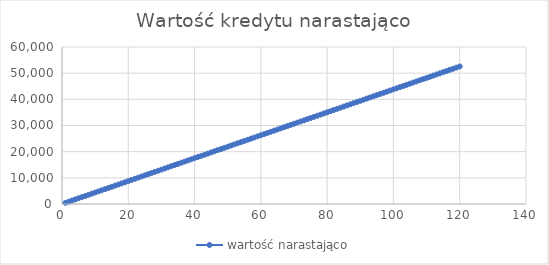
| Category | wartość narastająco |
|---|---|
| 0 | 438.021 |
| 1 | 876.041 |
| 2 | 1314.062 |
| 3 | 1752.082 |
| 4 | 2190.103 |
| 5 | 2628.124 |
| 6 | 3066.144 |
| 7 | 3504.165 |
| 8 | 3942.185 |
| 9 | 4380.206 |
| 10 | 4818.227 |
| 11 | 5256.247 |
| 12 | 5694.268 |
| 13 | 6132.288 |
| 14 | 6570.309 |
| 15 | 7008.33 |
| 16 | 7446.35 |
| 17 | 7884.371 |
| 18 | 8322.392 |
| 19 | 8760.412 |
| 20 | 9198.433 |
| 21 | 9636.453 |
| 22 | 10074.474 |
| 23 | 10512.495 |
| 24 | 10950.515 |
| 25 | 11388.536 |
| 26 | 11826.556 |
| 27 | 12264.577 |
| 28 | 12702.598 |
| 29 | 13140.618 |
| 30 | 13578.639 |
| 31 | 14016.659 |
| 32 | 14454.68 |
| 33 | 14892.701 |
| 34 | 15330.721 |
| 35 | 15768.742 |
| 36 | 16206.762 |
| 37 | 16644.783 |
| 38 | 17082.804 |
| 39 | 17520.824 |
| 40 | 17958.845 |
| 41 | 18396.865 |
| 42 | 18834.886 |
| 43 | 19272.907 |
| 44 | 19710.927 |
| 45 | 20148.948 |
| 46 | 20586.969 |
| 47 | 21024.989 |
| 48 | 21463.01 |
| 49 | 21901.03 |
| 50 | 22339.051 |
| 51 | 22777.072 |
| 52 | 23215.092 |
| 53 | 23653.113 |
| 54 | 24091.133 |
| 55 | 24529.154 |
| 56 | 24967.175 |
| 57 | 25405.195 |
| 58 | 25843.216 |
| 59 | 26281.236 |
| 60 | 26719.257 |
| 61 | 27157.278 |
| 62 | 27595.298 |
| 63 | 28033.319 |
| 64 | 28471.339 |
| 65 | 28909.36 |
| 66 | 29347.381 |
| 67 | 29785.401 |
| 68 | 30223.422 |
| 69 | 30661.442 |
| 70 | 31099.463 |
| 71 | 31537.484 |
| 72 | 31975.504 |
| 73 | 32413.525 |
| 74 | 32851.546 |
| 75 | 33289.566 |
| 76 | 33727.587 |
| 77 | 34165.607 |
| 78 | 34603.628 |
| 79 | 35041.649 |
| 80 | 35479.669 |
| 81 | 35917.69 |
| 82 | 36355.71 |
| 83 | 36793.731 |
| 84 | 37231.752 |
| 85 | 37669.772 |
| 86 | 38107.793 |
| 87 | 38545.813 |
| 88 | 38983.834 |
| 89 | 39421.855 |
| 90 | 39859.875 |
| 91 | 40297.896 |
| 92 | 40735.916 |
| 93 | 41173.937 |
| 94 | 41611.958 |
| 95 | 42049.978 |
| 96 | 42487.999 |
| 97 | 42926.019 |
| 98 | 43364.04 |
| 99 | 43802.061 |
| 100 | 44240.081 |
| 101 | 44678.102 |
| 102 | 45116.123 |
| 103 | 45554.143 |
| 104 | 45992.164 |
| 105 | 46430.184 |
| 106 | 46868.205 |
| 107 | 47306.226 |
| 108 | 47744.246 |
| 109 | 48182.267 |
| 110 | 48620.287 |
| 111 | 49058.308 |
| 112 | 49496.329 |
| 113 | 49934.349 |
| 114 | 50372.37 |
| 115 | 50810.39 |
| 116 | 51248.411 |
| 117 | 51686.432 |
| 118 | 52124.452 |
| 119 | 52562.473 |
| 120 | 0 |
| 121 | 0 |
| 122 | 0 |
| 123 | 0 |
| 124 | 0 |
| 125 | 0 |
| 126 | 0 |
| 127 | 0 |
| 128 | 0 |
| 129 | 0 |
| 130 | 0 |
| 131 | 0 |
| 132 | 0 |
| 133 | 0 |
| 134 | 0 |
| 135 | 0 |
| 136 | 0 |
| 137 | 0 |
| 138 | 0 |
| 139 | 0 |
| 140 | 0 |
| 141 | 0 |
| 142 | 0 |
| 143 | 0 |
| 144 | 0 |
| 145 | 0 |
| 146 | 0 |
| 147 | 0 |
| 148 | 0 |
| 149 | 0 |
| 150 | 0 |
| 151 | 0 |
| 152 | 0 |
| 153 | 0 |
| 154 | 0 |
| 155 | 0 |
| 156 | 0 |
| 157 | 0 |
| 158 | 0 |
| 159 | 0 |
| 160 | 0 |
| 161 | 0 |
| 162 | 0 |
| 163 | 0 |
| 164 | 0 |
| 165 | 0 |
| 166 | 0 |
| 167 | 0 |
| 168 | 0 |
| 169 | 0 |
| 170 | 0 |
| 171 | 0 |
| 172 | 0 |
| 173 | 0 |
| 174 | 0 |
| 175 | 0 |
| 176 | 0 |
| 177 | 0 |
| 178 | 0 |
| 179 | 0 |
| 180 | 0 |
| 181 | 0 |
| 182 | 0 |
| 183 | 0 |
| 184 | 0 |
| 185 | 0 |
| 186 | 0 |
| 187 | 0 |
| 188 | 0 |
| 189 | 0 |
| 190 | 0 |
| 191 | 0 |
| 192 | 0 |
| 193 | 0 |
| 194 | 0 |
| 195 | 0 |
| 196 | 0 |
| 197 | 0 |
| 198 | 0 |
| 199 | 0 |
| 200 | 0 |
| 201 | 0 |
| 202 | 0 |
| 203 | 0 |
| 204 | 0 |
| 205 | 0 |
| 206 | 0 |
| 207 | 0 |
| 208 | 0 |
| 209 | 0 |
| 210 | 0 |
| 211 | 0 |
| 212 | 0 |
| 213 | 0 |
| 214 | 0 |
| 215 | 0 |
| 216 | 0 |
| 217 | 0 |
| 218 | 0 |
| 219 | 0 |
| 220 | 0 |
| 221 | 0 |
| 222 | 0 |
| 223 | 0 |
| 224 | 0 |
| 225 | 0 |
| 226 | 0 |
| 227 | 0 |
| 228 | 0 |
| 229 | 0 |
| 230 | 0 |
| 231 | 0 |
| 232 | 0 |
| 233 | 0 |
| 234 | 0 |
| 235 | 0 |
| 236 | 0 |
| 237 | 0 |
| 238 | 0 |
| 239 | 0 |
| 240 | 0 |
| 241 | 0 |
| 242 | 0 |
| 243 | 0 |
| 244 | 0 |
| 245 | 0 |
| 246 | 0 |
| 247 | 0 |
| 248 | 0 |
| 249 | 0 |
| 250 | 0 |
| 251 | 0 |
| 252 | 0 |
| 253 | 0 |
| 254 | 0 |
| 255 | 0 |
| 256 | 0 |
| 257 | 0 |
| 258 | 0 |
| 259 | 0 |
| 260 | 0 |
| 261 | 0 |
| 262 | 0 |
| 263 | 0 |
| 264 | 0 |
| 265 | 0 |
| 266 | 0 |
| 267 | 0 |
| 268 | 0 |
| 269 | 0 |
| 270 | 0 |
| 271 | 0 |
| 272 | 0 |
| 273 | 0 |
| 274 | 0 |
| 275 | 0 |
| 276 | 0 |
| 277 | 0 |
| 278 | 0 |
| 279 | 0 |
| 280 | 0 |
| 281 | 0 |
| 282 | 0 |
| 283 | 0 |
| 284 | 0 |
| 285 | 0 |
| 286 | 0 |
| 287 | 0 |
| 288 | 0 |
| 289 | 0 |
| 290 | 0 |
| 291 | 0 |
| 292 | 0 |
| 293 | 0 |
| 294 | 0 |
| 295 | 0 |
| 296 | 0 |
| 297 | 0 |
| 298 | 0 |
| 299 | 0 |
| 300 | 0 |
| 301 | 0 |
| 302 | 0 |
| 303 | 0 |
| 304 | 0 |
| 305 | 0 |
| 306 | 0 |
| 307 | 0 |
| 308 | 0 |
| 309 | 0 |
| 310 | 0 |
| 311 | 0 |
| 312 | 0 |
| 313 | 0 |
| 314 | 0 |
| 315 | 0 |
| 316 | 0 |
| 317 | 0 |
| 318 | 0 |
| 319 | 0 |
| 320 | 0 |
| 321 | 0 |
| 322 | 0 |
| 323 | 0 |
| 324 | 0 |
| 325 | 0 |
| 326 | 0 |
| 327 | 0 |
| 328 | 0 |
| 329 | 0 |
| 330 | 0 |
| 331 | 0 |
| 332 | 0 |
| 333 | 0 |
| 334 | 0 |
| 335 | 0 |
| 336 | 0 |
| 337 | 0 |
| 338 | 0 |
| 339 | 0 |
| 340 | 0 |
| 341 | 0 |
| 342 | 0 |
| 343 | 0 |
| 344 | 0 |
| 345 | 0 |
| 346 | 0 |
| 347 | 0 |
| 348 | 0 |
| 349 | 0 |
| 350 | 0 |
| 351 | 0 |
| 352 | 0 |
| 353 | 0 |
| 354 | 0 |
| 355 | 0 |
| 356 | 0 |
| 357 | 0 |
| 358 | 0 |
| 359 | 0 |